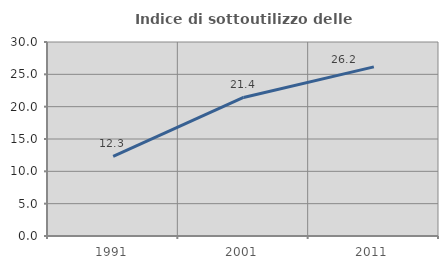
| Category | Indice di sottoutilizzo delle abitazioni  |
|---|---|
| 1991.0 | 12.329 |
| 2001.0 | 21.429 |
| 2011.0 | 26.154 |